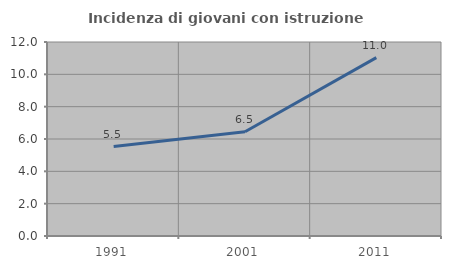
| Category | Incidenza di giovani con istruzione universitaria |
|---|---|
| 1991.0 | 5.532 |
| 2001.0 | 6.452 |
| 2011.0 | 11.034 |